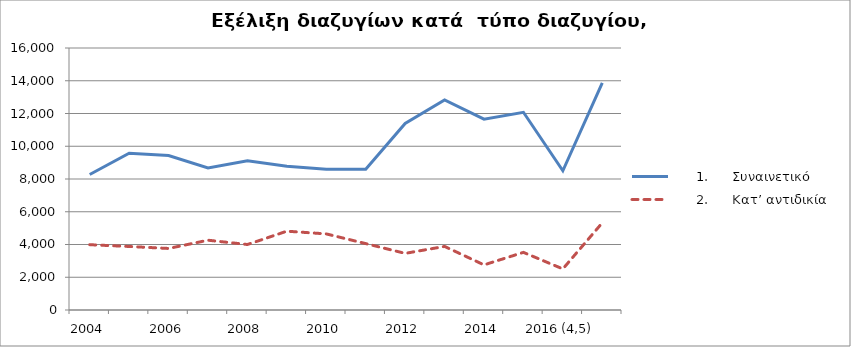
| Category |       1.      Συναινετικό  |       2.      Κατ’ αντιδικία |
|---|---|---|
| 2004 | 8276 | 3988 |
| 2005 | 9575 | 3879 |
| 2006 | 9436 | 3758 |
| 2007 | 8671 | 4262 |
| 2008 | 9118 | 3999 |
| 2009 | 8777 | 4813 |
| 2010 | 8589 | 4647 |
| 2011 | 8602 | 4055 |
| 2012 | 11395 | 3458 |
| 2013 | 12823 | 3883 |
| 2014 | 11651 | 2755 |
| 2015 | 12075 | 3519 |
| 2016 (4,5) | 8504 | 2509 |
| 2017 | 13865 | 5325 |